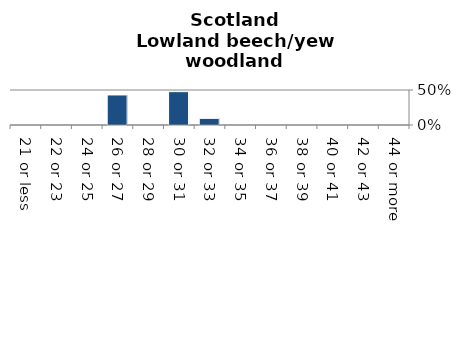
| Category | Lowland beech/yew woodland |
|---|---|
| 21 or less | 0 |
| 22 or 23 | 0 |
| 24 or 25 | 0 |
| 26 or 27 | 0.429 |
| 28 or 29 | 0 |
| 30 or 31 | 0.476 |
| 32 or 33 | 0.095 |
| 34 or 35 | 0 |
| 36 or 37 | 0 |
| 38 or 39 | 0 |
| 40 or 41 | 0 |
| 42 or 43 | 0 |
| 44 or more | 0 |